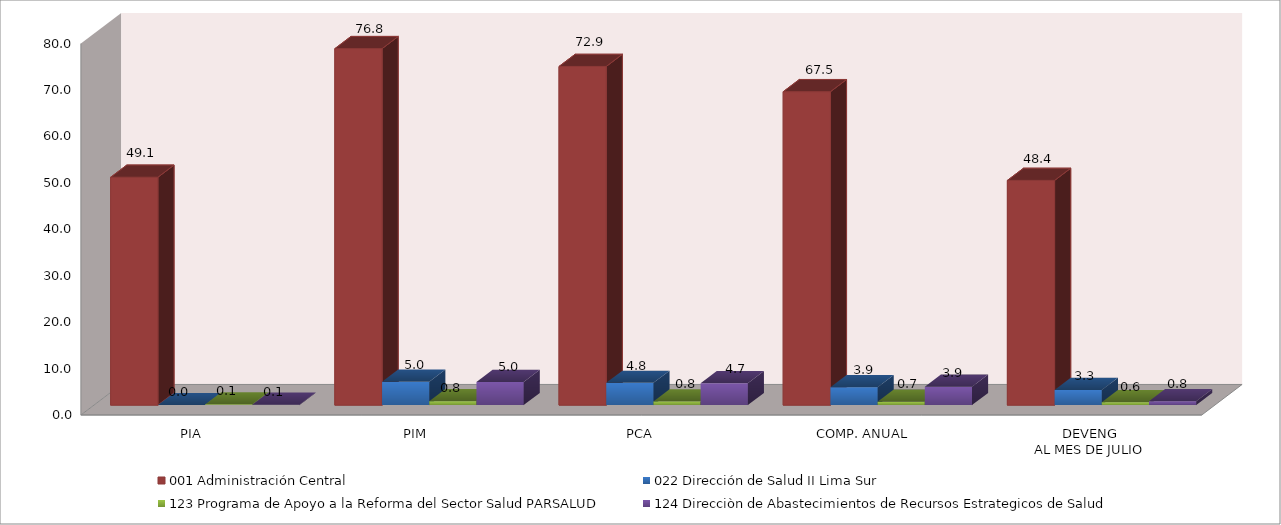
| Category | 001 Administración Central | 022 Dirección de Salud II Lima Sur | 123 Programa de Apoyo a la Reforma del Sector Salud PARSALUD | 124 Direcciòn de Abastecimientos de Recursos Estrategicos de Salud |
|---|---|---|---|---|
| PIA | 49.074 | 0 | 0.136 | 0.1 |
| PIM | 76.773 | 5.044 | 0.836 | 4.967 |
| PCA | 72.935 | 4.792 | 0.794 | 4.719 |
| COMP. ANUAL | 67.498 | 3.856 | 0.707 | 3.946 |
| DEVENG
AL MES DE JULIO | 48.39 | 3.254 | 0.597 | 0.819 |